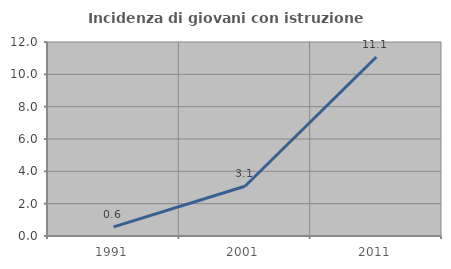
| Category | Incidenza di giovani con istruzione universitaria |
|---|---|
| 1991.0 | 0.568 |
| 2001.0 | 3.077 |
| 2011.0 | 11.075 |